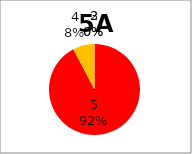
| Category | Series 0 |
|---|---|
| 5.0 | 12 |
| 4.0 | 1 |
| 3.0 | 0 |
| 2.0 | 0 |